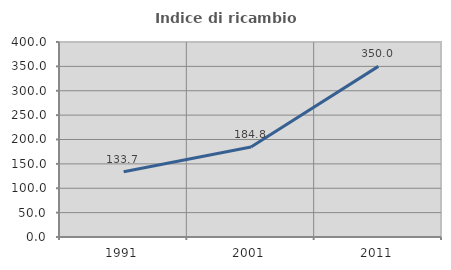
| Category | Indice di ricambio occupazionale  |
|---|---|
| 1991.0 | 133.673 |
| 2001.0 | 184.81 |
| 2011.0 | 350 |